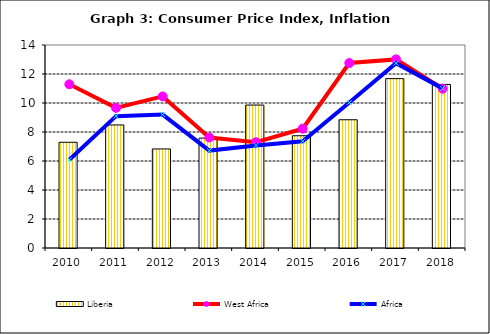
| Category | Liberia |
|---|---|
| 2010.0 | 7.291 |
| 2011.0 | 8.487 |
| 2012.0 | 6.832 |
| 2013.0 | 7.578 |
| 2014.0 | 9.858 |
| 2015.0 | 7.742 |
| 2016.0 | 8.844 |
| 2017.0 | 11.68 |
| 2018.0 | 11.281 |